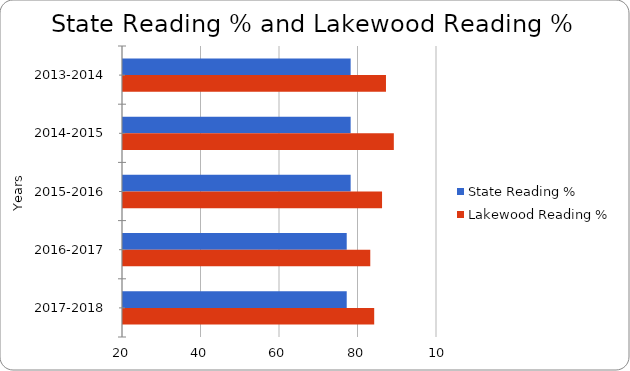
| Category | State Reading % | Lakewood Reading % |
|---|---|---|
| 2013-2014 | 78 | 87 |
| 2014-2015 | 78 | 89 |
| 2015-2016 | 78 | 86 |
| 2016-2017 | 77 | 83 |
| 2017-2018 | 77 | 84 |